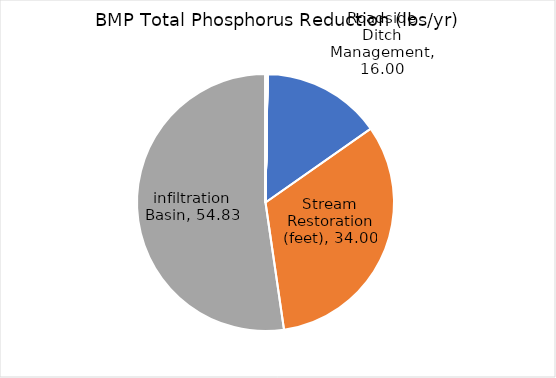
| Category | TP Reduction |
|---|---|
| Roadside Ditch Management | 16 |
| Stream Restoration (feet) | 34 |
| infiltration Basin | 54.825 |